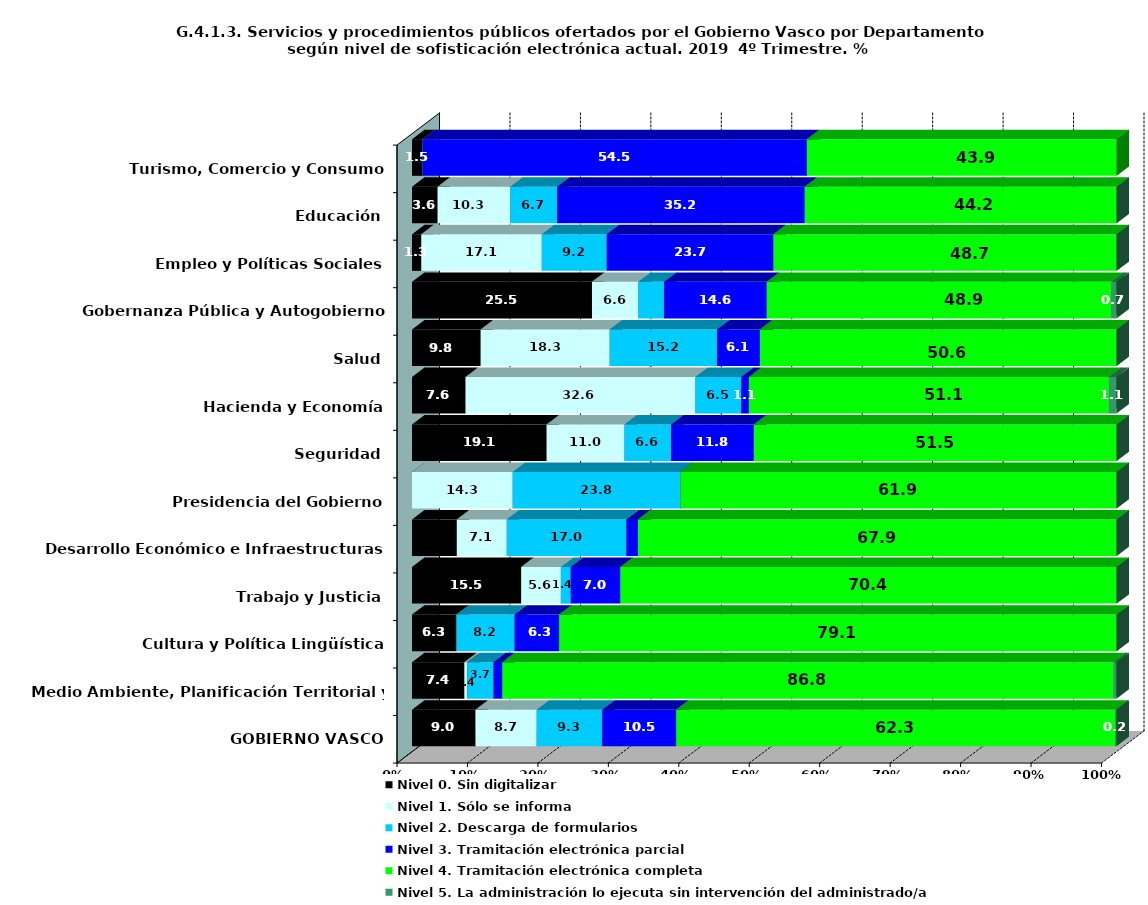
| Category | Nivel 0. Sin digitalizar | Nivel 1. Sólo se informa | Nivel 2. Descarga de formularios | Nivel 3. Tramitación electrónica parcial | Nivel 4. Tramitación electrónica completa | Nivel 5. La administración lo ejecuta sin intervención del administrado/a |
|---|---|---|---|---|---|---|
| GOBIERNO VASCO | 9.018 | 8.676 | 9.304 | 10.502 | 62.329 | 0.171 |
| Medio Ambiente, Planificación Territorial y Vivienda | 7.438 | 0.413 | 3.719 | 1.24 | 86.777 | 0.413 |
| Cultura y Política Lingüística | 6.329 | 0 | 8.228 | 6.329 | 79.114 | 0 |
| Trabajo y Justicia | 15.493 | 5.634 | 1.408 | 7.042 | 70.423 | 0 |
| Desarrollo Económico e Infraestructuras | 6.368 | 7.075 | 16.981 | 1.651 | 67.925 | 0 |
| Presidencia del Gobierno | 0 | 14.286 | 23.81 | 0 | 61.905 | 0 |
| Seguridad | 19.118 | 11.029 | 6.618 | 11.765 | 51.471 | 0 |
| Hacienda y Economía | 7.609 | 32.609 | 6.522 | 1.087 | 51.087 | 1.087 |
| Salud | 9.756 | 18.293 | 15.244 | 6.098 | 50.61 | 0 |
| Gobernanza Pública y Autogobierno | 25.547 | 6.569 | 3.65 | 14.599 | 48.905 | 0.73 |
| Empleo y Políticas Sociales | 1.316 | 17.105 | 9.211 | 23.684 | 48.684 | 0 |
| Educación | 3.636 | 10.303 | 6.667 | 35.152 | 44.242 | 0 |
| Turismo, Comercio y Consumo | 1.515 | 0 | 0 | 54.545 | 43.939 | 0 |